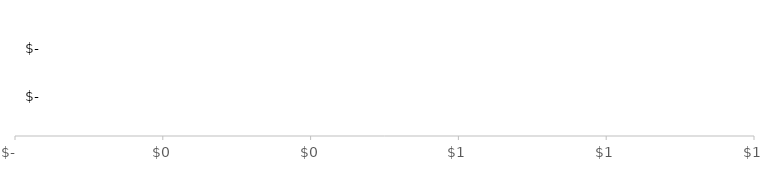
| Category | GESAMTFINANZIERUNG  | GESAMTAUSGABEN |
|---|---|---|
| 0 | 0 | 0 |